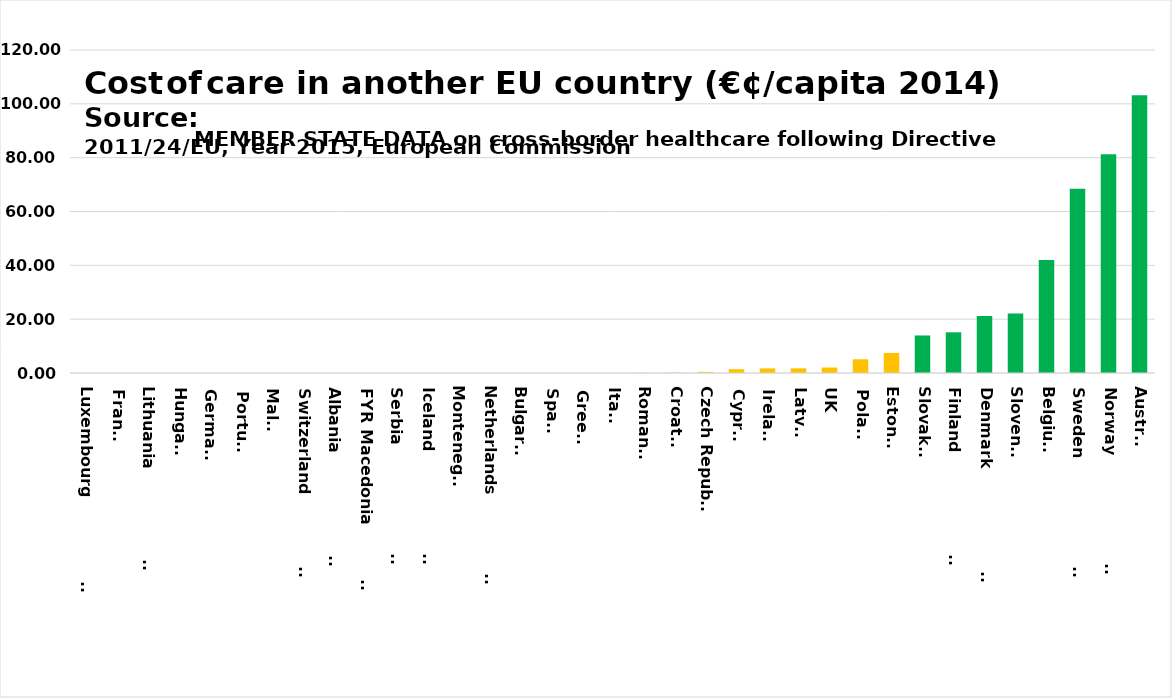
| Category | Series 0 |
|---|---|
| Luxembourg                    | 0 |
| France | 0 |
| Lithuania                     | 0 |
| Hungary | 0 |
| Germany | 0 |
| Portugal | 0 |
| Malta | 0 |
| Switzerland                   | 0 |
| Albania                       | 0 |
| FYR Macedonia                | 0 |
| Serbia                        | 0 |
| Iceland                       | 0 |
| Montenegro | 0 |
| Netherlands                   | 0 |
| Bulgaria | 0.006 |
| Spain | 0.009 |
| Greece | 0.023 |
| Italy | 0.036 |
| Romania | 0.083 |
| Croatia | 0.141 |
| Czech Republic | 0.402 |
| Cyprus | 1.411 |
| Ireland | 1.712 |
| Latvia | 1.738 |
| UK | 2.034 |
| Poland | 5.094 |
| Estonia | 7.45 |
| Slovakia | 13.943 |
| Finland                       | 15.12 |
| Denmark                       | 21.182 |
| Slovenia | 22.11 |
| Belgium | 41.979 |
| Sweden                        | 68.475 |
| Norway                        | 81.227 |
| Austria | 103.2 |